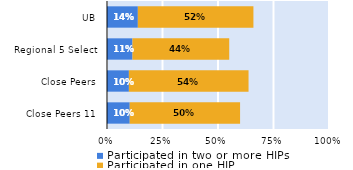
| Category | Participated in two or more HIPs | Participated in one HIP |
|---|---|---|
| Close Peers 11 | 0.102 | 0.497 |
| Close Peers | 0.099 | 0.539 |
| Regional 5 Select | 0.115 | 0.436 |
| UB | 0.139 | 0.521 |